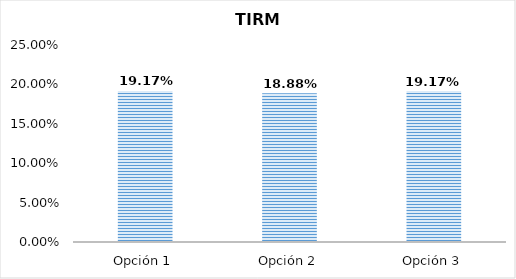
| Category | TIRM [%] |
|---|---|
| Opción 1 | 0.192 |
| Opción 2 | 0.189 |
| Opción 3 | 0.192 |